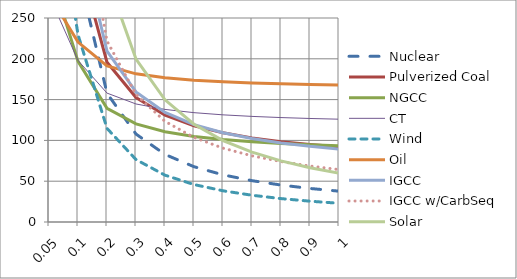
| Category | Nuclear | Pulverized Coal | NGCC | CT | Wind | Oil | IGCC | IGCC w/CarbSeq | Solar |
|---|---|---|---|---|---|---|---|---|---|
| 0.05 | 607.582 | 585.012 | 311.671 | 277.916 | 459 | 278.839 | 659.165 | 812.988 | 1198.163 |
| 0.1 | 307.691 | 325.511 | 196.804 | 197.953 | 229.5 | 220.472 | 359.274 | 418.892 | 599.081 |
| 0.2 | 157.745 | 195.76 | 139.371 | 157.972 | 114.75 | 191.289 | 209.328 | 221.844 | 299.541 |
| 0.3 | 107.764 | 152.51 | 120.226 | 144.644 | 76.5 | 181.561 | 159.347 | 156.162 | 199.694 |
| 0.4 | 82.773 | 130.885 | 110.654 | 137.981 | 57.375 | 176.697 | 134.356 | 123.32 | 149.77 |
| 0.5 | 67.778 | 117.91 | 104.911 | 133.983 | 45.9 | 173.778 | 119.361 | 103.615 | 119.816 |
| 0.6 | 57.782 | 109.26 | 101.082 | 131.317 | 38.25 | 171.833 | 109.365 | 90.479 | 99.847 |
| 0.7 | 50.642 | 103.082 | 98.347 | 129.413 | 32.786 | 170.443 | 102.224 | 81.096 | 85.583 |
| 0.8 | 45.286 | 98.448 | 96.296 | 127.985 | 28.688 | 169.401 | 96.869 | 74.058 | 74.885 |
| 0.9 | 41.121 | 94.843 | 94.7 | 126.875 | 25.5 | 168.59 | 92.704 | 68.585 | 66.565 |
| 1.0 | 37.789 | 91.96 | 93.424 | 125.986 | 22.95 | 167.942 | 89.372 | 64.206 | 59.908 |